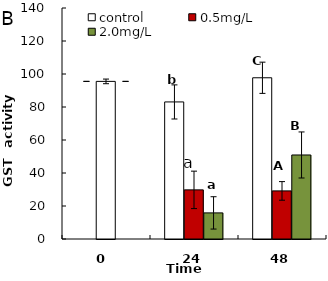
| Category | control | 0.5mg/L | 2.0mg/L |
|---|---|---|---|
| 0.0 | 95.523 | 95.523 | 95.523 |
| 24.0 | 83.072 | 29.774 | 15.823 |
| 48.0 | 97.71 | 29.148 | 50.928 |